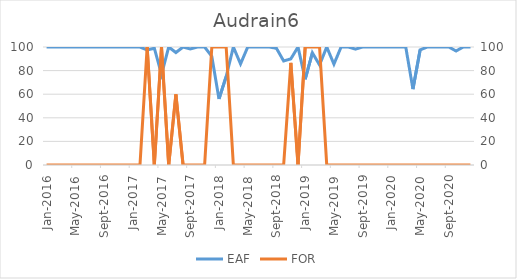
| Category | EAF |
|---|---|
| 2016-01-01 | 100 |
| 2016-02-01 | 100 |
| 2016-03-01 | 100 |
| 2016-04-01 | 100 |
| 2016-05-01 | 100 |
| 2016-06-01 | 100 |
| 2016-07-01 | 100 |
| 2016-08-01 | 100 |
| 2016-09-01 | 100 |
| 2016-10-01 | 100 |
| 2016-11-01 | 100 |
| 2016-12-01 | 100 |
| 2017-01-01 | 100 |
| 2017-02-01 | 100 |
| 2017-03-01 | 97.51 |
| 2017-04-01 | 98.96 |
| 2017-05-01 | 76.78 |
| 2017-06-01 | 100 |
| 2017-07-01 | 95.34 |
| 2017-08-01 | 100 |
| 2017-09-01 | 98.37 |
| 2017-10-01 | 100 |
| 2017-11-01 | 100 |
| 2017-12-01 | 92 |
| 2018-01-01 | 56.01 |
| 2018-02-01 | 75 |
| 2018-03-01 | 100 |
| 2018-04-01 | 85.67 |
| 2018-05-01 | 100 |
| 2018-06-01 | 100 |
| 2018-07-01 | 100 |
| 2018-08-01 | 100 |
| 2018-09-01 | 98.89 |
| 2018-10-01 | 88.16 |
| 2018-11-01 | 89.95 |
| 2018-12-01 | 100 |
| 2019-01-01 | 72.65 |
| 2019-02-01 | 95.09 |
| 2019-03-01 | 84.79 |
| 2019-04-01 | 100 |
| 2019-05-01 | 85.47 |
| 2019-06-01 | 100 |
| 2019-07-01 | 100 |
| 2019-08-01 | 98.21 |
| 2019-09-01 | 100 |
| 2019-10-01 | 100 |
| 2019-11-01 | 100 |
| 2019-12-01 | 100 |
| 2020-01-01 | 100 |
| 2020-02-01 | 100 |
| 2020-03-01 | 100 |
| 2020-04-01 | 64.31 |
| 2020-05-01 | 97.57 |
| 2020-06-01 | 100 |
| 2020-07-01 | 100 |
| 2020-08-01 | 100 |
| 2020-09-01 | 100 |
| 2020-10-01 | 96.62 |
| 2020-11-01 | 100 |
| 2020-12-01 | 100 |